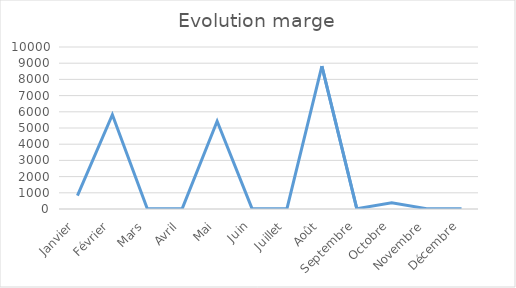
| Category | Series 0 |
|---|---|
| Janvier | 820 |
| Février | 5820 |
| Mars | 20 |
| Avril | 20 |
| Mai | 5420 |
| Juin | 20 |
| Juillet | 20 |
| Août | 8820 |
| Septembre | 20 |
| Octobre | 387 |
| Novembre | 20 |
| Décembre | 20 |